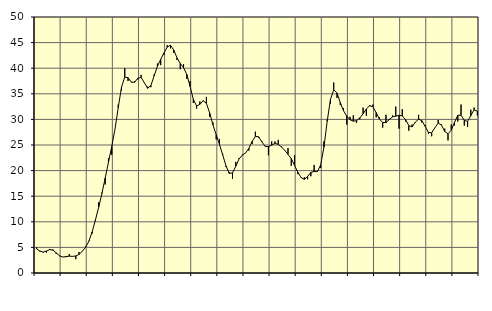
| Category | Piggar | Series 1 |
|---|---|---|
| nan | 5 | 4.7 |
| 87.0 | 4.2 | 4.3 |
| 87.0 | 4 | 4.08 |
| 87.0 | 4 | 4.28 |
| nan | 4.7 | 4.57 |
| 88.0 | 4.6 | 4.46 |
| 88.0 | 3.7 | 3.93 |
| 88.0 | 3.3 | 3.37 |
| nan | 3.1 | 3.12 |
| 89.0 | 3.1 | 3.2 |
| 89.0 | 3.7 | 3.29 |
| 89.0 | 3.2 | 3.25 |
| nan | 2.7 | 3.33 |
| 90.0 | 4.1 | 3.64 |
| 90.0 | 4.3 | 4.24 |
| 90.0 | 5.2 | 5.01 |
| nan | 6.3 | 6.19 |
| 91.0 | 7.7 | 8.01 |
| 91.0 | 10.2 | 10.33 |
| 91.0 | 13.8 | 12.85 |
| nan | 15.7 | 15.53 |
| 92.0 | 17.3 | 18.55 |
| 92.0 | 22.4 | 21.61 |
| 92.0 | 23.1 | 24.68 |
| nan | 28.1 | 28.09 |
| 93.0 | 32.9 | 32.32 |
| 93.0 | 35.6 | 36.3 |
| 93.0 | 40 | 38.25 |
| nan | 37.5 | 38.15 |
| 94.0 | 37.3 | 37.27 |
| 94.0 | 37.5 | 37.26 |
| 94.0 | 37.8 | 38.04 |
| nan | 38.7 | 38.19 |
| 95.0 | 37.1 | 37.15 |
| 95.0 | 36.4 | 36.08 |
| 95.0 | 36.3 | 36.63 |
| nan | 38.8 | 38.52 |
| 96.0 | 40.9 | 40.38 |
| 96.0 | 40.6 | 41.73 |
| 96.0 | 42.6 | 42.98 |
| nan | 44.5 | 44.12 |
| 97.0 | 43.9 | 44.49 |
| 97.0 | 43 | 43.54 |
| 97.0 | 41.6 | 42.02 |
| nan | 39.8 | 40.91 |
| 98.0 | 40.8 | 40.12 |
| 98.0 | 37.9 | 38.77 |
| 98.0 | 37.5 | 36.44 |
| nan | 33.2 | 33.9 |
| 99.0 | 32.1 | 32.62 |
| 99.0 | 33.5 | 32.94 |
| 99.0 | 33.7 | 33.64 |
| nan | 34.4 | 33.14 |
| 0.0 | 30.5 | 31.25 |
| 0.0 | 29.4 | 28.95 |
| 0.0 | 26.1 | 27.02 |
| nan | 26.2 | 25.12 |
| 1.0 | 23.2 | 23.06 |
| 1.0 | 20.7 | 20.93 |
| 1.0 | 19.7 | 19.45 |
| nan | 18.4 | 19.55 |
| 2.0 | 21.7 | 20.84 |
| 2.0 | 22.4 | 22.27 |
| 2.0 | 23.1 | 23.03 |
| nan | 23.4 | 23.43 |
| 3.0 | 23.9 | 24.34 |
| 3.0 | 25.2 | 25.69 |
| 3.0 | 27.6 | 26.68 |
| nan | 26.4 | 26.6 |
| 4.0 | 25.7 | 25.59 |
| 4.0 | 24.7 | 24.76 |
| 4.0 | 23 | 24.67 |
| nan | 25.7 | 24.97 |
| 5.0 | 25.7 | 25.3 |
| 5.0 | 26 | 25.12 |
| 5.0 | 24.7 | 24.62 |
| nan | 24 | 23.95 |
| 6.0 | 24.4 | 23.18 |
| 6.0 | 20.9 | 22.33 |
| 6.0 | 23 | 21.04 |
| nan | 19.3 | 19.68 |
| 7.0 | 18.6 | 18.64 |
| 7.0 | 18.7 | 18.29 |
| 7.0 | 18.3 | 18.86 |
| nan | 18.9 | 19.65 |
| 8.0 | 21.1 | 19.83 |
| 8.0 | 19.8 | 19.78 |
| 8.0 | 20.5 | 21.11 |
| nan | 25.7 | 24.56 |
| 9.0 | 30 | 29.63 |
| 9.0 | 33.1 | 33.91 |
| 9.0 | 37.2 | 35.79 |
| nan | 34.2 | 35.17 |
| 10.0 | 32.8 | 33.31 |
| 10.0 | 32.2 | 31.69 |
| 10.0 | 29 | 30.63 |
| nan | 30.5 | 29.94 |
| 11.0 | 30.8 | 29.65 |
| 11.0 | 29.3 | 29.76 |
| 11.0 | 30 | 30.29 |
| nan | 32.3 | 31.1 |
| 12.0 | 30.7 | 32.03 |
| 12.0 | 32.8 | 32.67 |
| 12.0 | 32.9 | 32.47 |
| nan | 30.4 | 31.34 |
| 13.0 | 30.4 | 30.04 |
| 13.0 | 28.4 | 29.42 |
| 13.0 | 30.9 | 29.37 |
| nan | 30.1 | 29.95 |
| 14.0 | 30.8 | 30.49 |
| 14.0 | 32.5 | 30.62 |
| 14.0 | 28.2 | 30.81 |
| nan | 32 | 30.69 |
| 15.0 | 29.6 | 29.98 |
| 15.0 | 27.8 | 28.79 |
| 15.0 | 29 | 28.53 |
| nan | 29.4 | 29.48 |
| 16.0 | 30.9 | 30.04 |
| 16.0 | 29.4 | 29.75 |
| 16.0 | 28.9 | 28.65 |
| nan | 27.2 | 27.46 |
| 17.0 | 26.7 | 27.39 |
| 17.0 | 28.4 | 28.37 |
| 17.0 | 29.9 | 29.29 |
| nan | 29 | 28.9 |
| 18.0 | 28.2 | 27.64 |
| 18.0 | 25.9 | 27.2 |
| 18.0 | 29 | 27.88 |
| nan | 28.8 | 29.41 |
| 19.0 | 29.6 | 30.81 |
| 19.0 | 32.9 | 30.8 |
| 19.0 | 28.8 | 29.82 |
| nan | 28.5 | 29.59 |
| 20.0 | 31.9 | 30.75 |
| 20.0 | 32.3 | 31.87 |
| 20.0 | 30.8 | 31.59 |